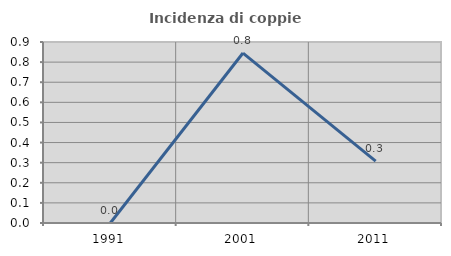
| Category | Incidenza di coppie miste |
|---|---|
| 1991.0 | 0 |
| 2001.0 | 0.845 |
| 2011.0 | 0.308 |